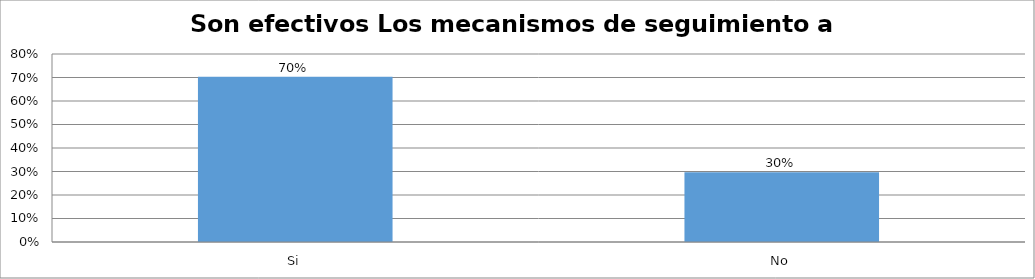
| Category | Series 0 |
|---|---|
| Si | 0.704 |
| No | 0.296 |